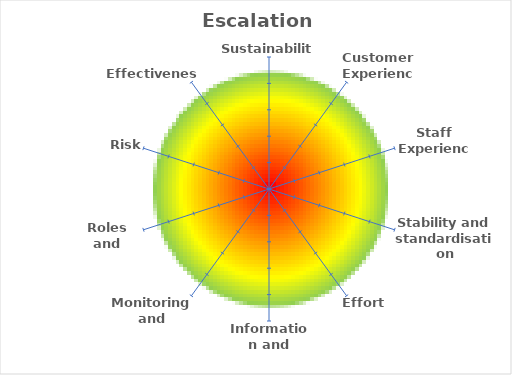
| Category | Escalations |
|---|---|
| Sustainability | 0 |
| Customer Experience | 0 |
| Staff Experience | 0 |
| Stability and standardisation | 0 |
| Effort | 0 |
| Information and records | 0 |
| Monitoring and oversight | 0 |
| Roles and resources | 0 |
| Risk | 0 |
| Effectiveness | 0 |